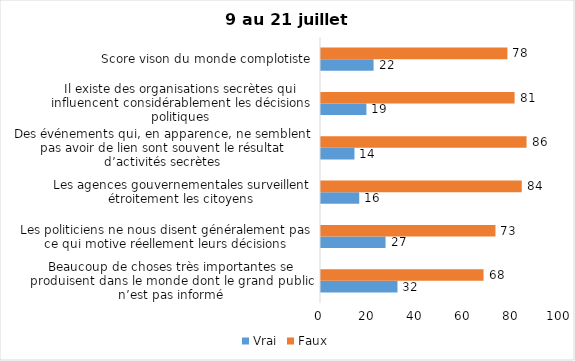
| Category | Vrai | Faux |
|---|---|---|
| Beaucoup de choses très importantes se produisent dans le monde dont le grand public n’est pas informé | 32 | 68 |
| Les politiciens ne nous disent généralement pas ce qui motive réellement leurs décisions | 27 | 73 |
| Les agences gouvernementales surveillent étroitement les citoyens | 16 | 84 |
| Des événements qui, en apparence, ne semblent pas avoir de lien sont souvent le résultat d’activités secrètes | 14 | 86 |
| Il existe des organisations secrètes qui influencent considérablement les décisions politiques | 19 | 81 |
| Score vison du monde complotiste | 22 | 78 |